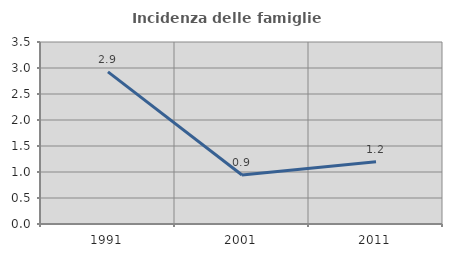
| Category | Incidenza delle famiglie numerose |
|---|---|
| 1991.0 | 2.925 |
| 2001.0 | 0.942 |
| 2011.0 | 1.197 |